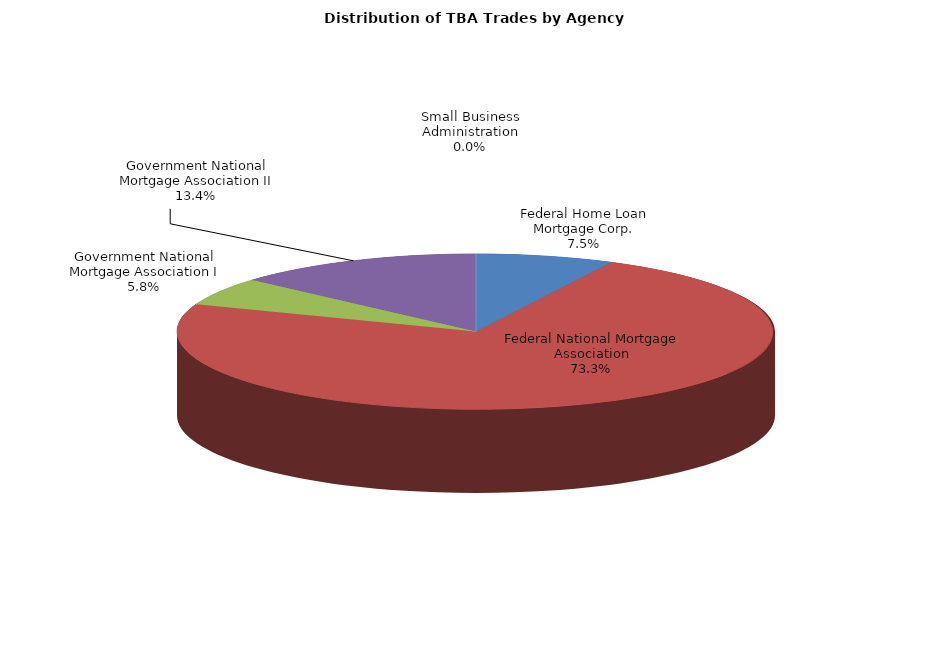
| Category | Series 0 |
|---|---|
| Federal Home Loan Mortgage Corp. | 525.909 |
| Federal National Mortgage Association | 5166.488 |
| Government National Mortgage Association I | 411.639 |
| Government National Mortgage Association II | 946.425 |
| Small Business Administration | 1.028 |